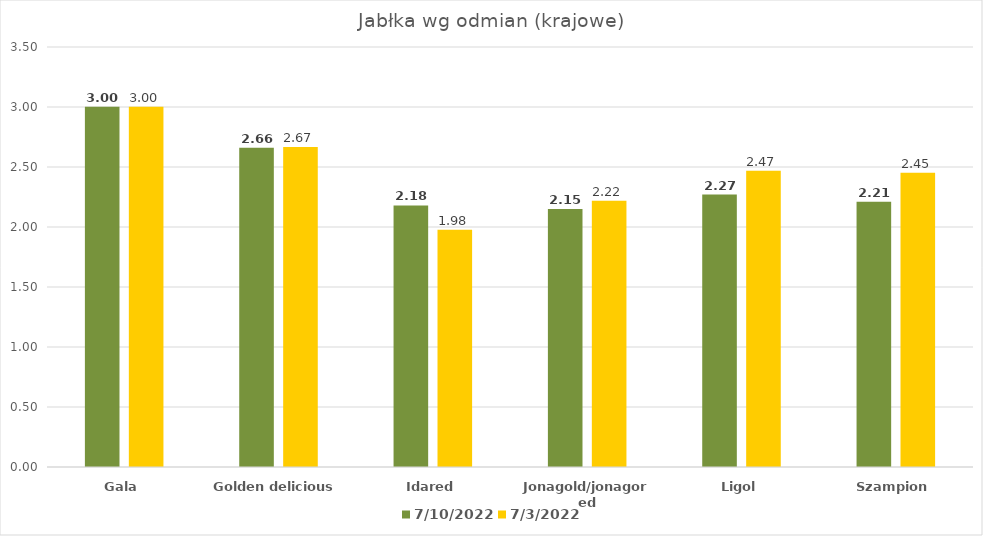
| Category | 10.07.2022 | 03.07.2022 |
|---|---|---|
| Gala | 3.002 | 3.002 |
| Golden delicious | 2.66 | 2.667 |
| Idared | 2.18 | 1.976 |
| Jonagold/jonagored | 2.15 | 2.218 |
| Ligol | 2.27 | 2.469 |
| Szampion | 2.21 | 2.452 |